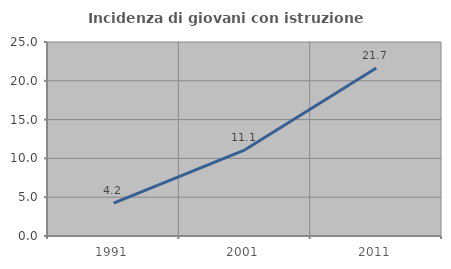
| Category | Incidenza di giovani con istruzione universitaria |
|---|---|
| 1991.0 | 4.235 |
| 2001.0 | 11.111 |
| 2011.0 | 21.661 |